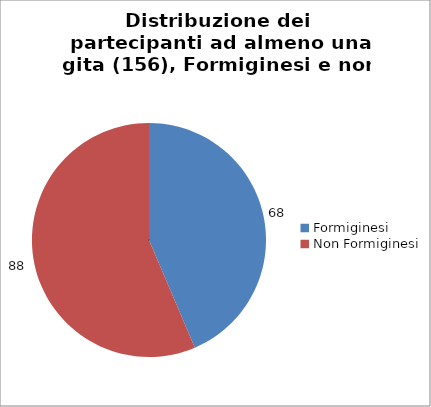
| Category | Nr. Tesserati |
|---|---|
| Formiginesi | 68 |
| Non Formiginesi | 88 |